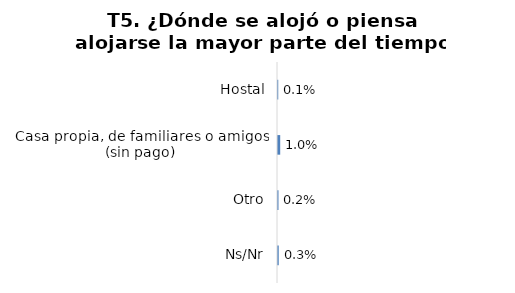
| Category | Series 0 |
|---|---|
| Hostal | 0.001 |
| Casa propia, de familiares o amigos (sin pago) | 0.01 |
| Otro | 0.002 |
| Ns/Nr | 0.003 |